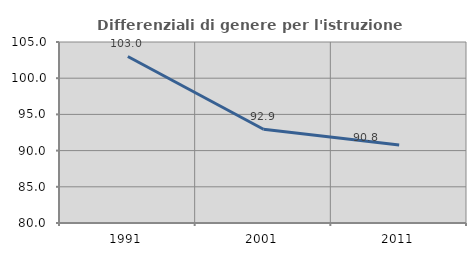
| Category | Differenziali di genere per l'istruzione superiore |
|---|---|
| 1991.0 | 103.002 |
| 2001.0 | 92.949 |
| 2011.0 | 90.78 |